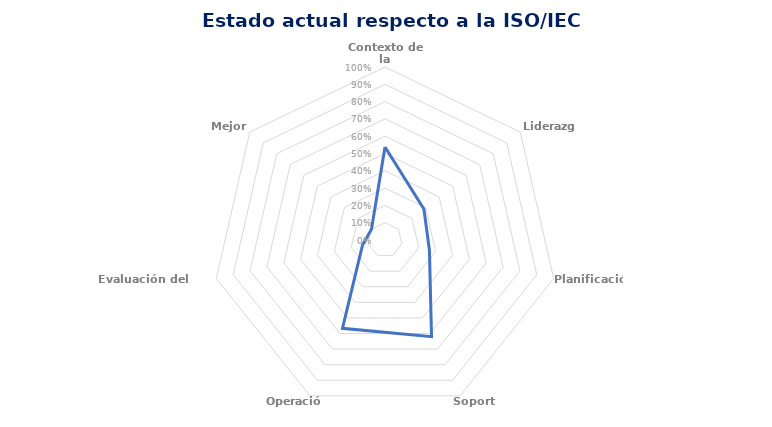
| Category | Series 0 |
|---|---|
| Contexto de la Organización | 0.538 |
| Liderazgo | 0.288 |
| Planificación | 0.263 |
| Soporte | 0.62 |
| Operación | 0.567 |
| Evaluación del Desempeño | 0.133 |
| Mejora | 0.1 |